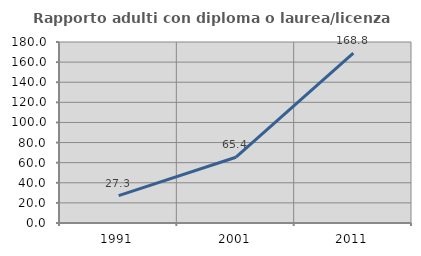
| Category | Rapporto adulti con diploma o laurea/licenza media  |
|---|---|
| 1991.0 | 27.273 |
| 2001.0 | 65.421 |
| 2011.0 | 168.831 |